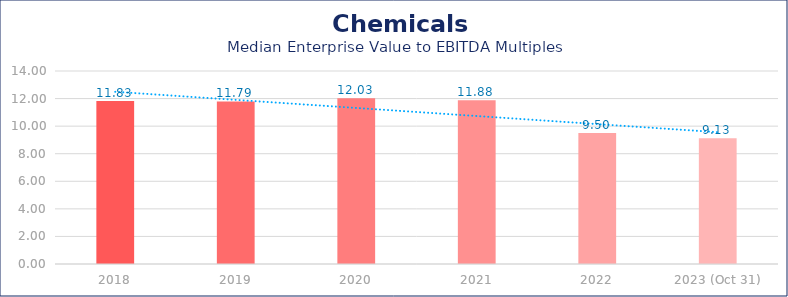
| Category | Chemicals |
|---|---|
| 2018 | 11.83 |
| 2019 | 11.79 |
| 2020 | 12.03 |
| 2021 | 11.88 |
| 2022 | 9.5 |
| 2023 (Oct 31) | 9.13 |